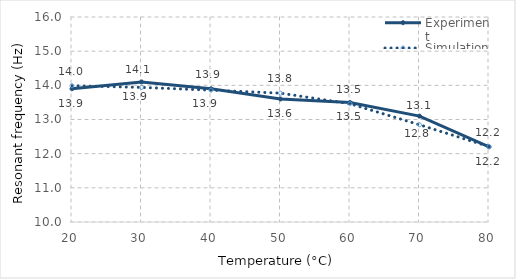
| Category | Experiment | Simulation |
|---|---|---|
| 20.0 | 13.9 | 13.989 |
| 30.0 | 14.1 | 13.94 |
| 40.0 | 13.9 | 13.859 |
| 50.0 | 13.6 | 13.771 |
| 60.0 | 13.5 | 13.461 |
| 70.0 | 13.1 | 12.845 |
| 80.0 | 12.2 | 12.208 |